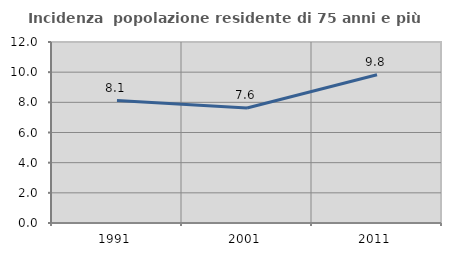
| Category | Incidenza  popolazione residente di 75 anni e più |
|---|---|
| 1991.0 | 8.117 |
| 2001.0 | 7.629 |
| 2011.0 | 9.828 |